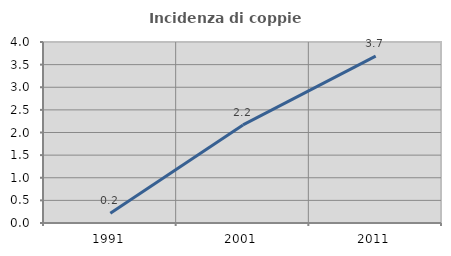
| Category | Incidenza di coppie miste |
|---|---|
| 1991.0 | 0.217 |
| 2001.0 | 2.168 |
| 2011.0 | 3.686 |